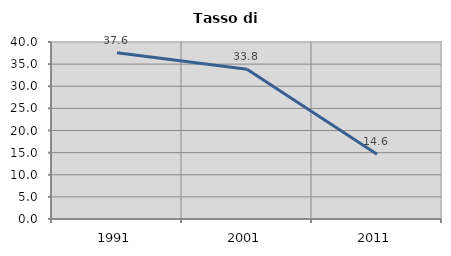
| Category | Tasso di disoccupazione   |
|---|---|
| 1991.0 | 37.591 |
| 2001.0 | 33.836 |
| 2011.0 | 14.629 |